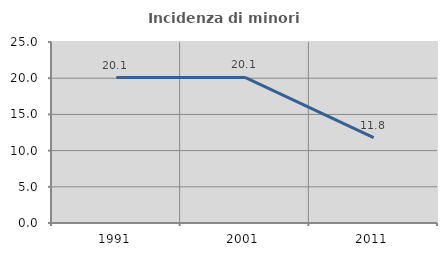
| Category | Incidenza di minori stranieri |
|---|---|
| 1991.0 | 20.08 |
| 2001.0 | 20.101 |
| 2011.0 | 11.805 |